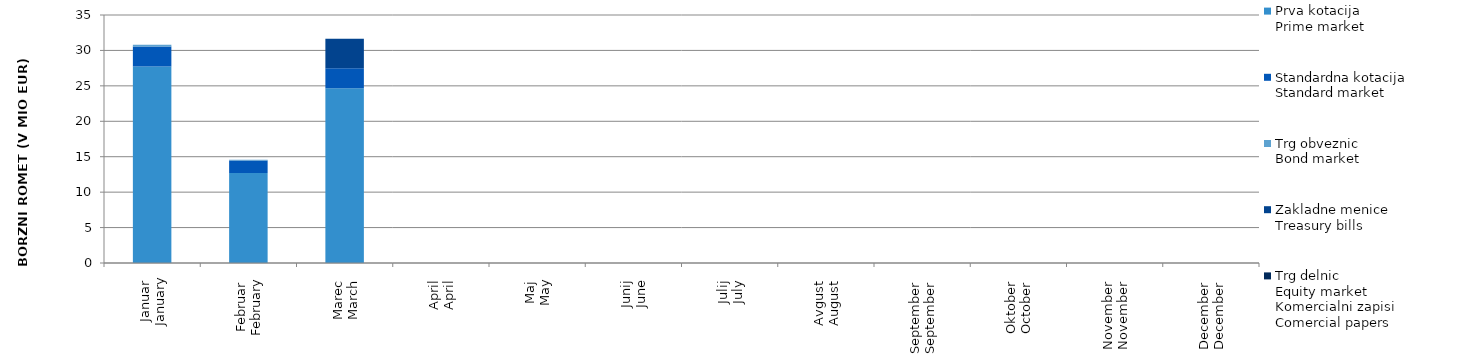
| Category | Prva kotacija
Prime market | Standardna kotacija
Standard market | Trg obveznic
Bond market | Zakladne menice
Treasury bills | Trg delnic
Equity market |
|---|---|---|---|---|---|
| Januar
January | 27.745 | 2.796 | 0.249 | 0 | 0 |
| Februar
February | 12.685 | 1.784 | 0.118 | 0 | 0 |
| Marec
March | 24.676 | 2.813 | 0 | 4.174 | 0 |
| April
April | 0 | 0 | 0 | 0 | 0 |
| Maj
May | 0 | 0 | 0 | 0 | 0 |
| Junij
June | 0 | 0 | 0 | 0 | 0 |
| Julij
July | 0 | 0 | 0 | 0 | 0 |
| Avgust
August | 0 | 0 | 0 | 0 | 0 |
| September
September | 0 | 0 | 0 | 0 | 0 |
| Oktober
October | 0 | 0 | 0 | 0 | 0 |
| November
November | 0 | 0 | 0 | 0 | 0 |
| December
December | 0 | 0 | 0 | 0 | 0 |